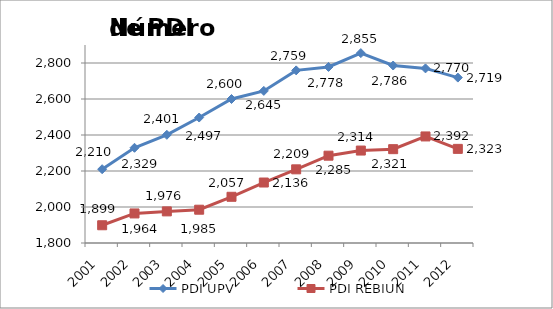
| Category | PDI UPV | PDI REBIUN |
|---|---|---|
| 2001 | 2210 | 1898.552 |
| 2002 | 2329 | 1964.22 |
| 2003 | 2401 | 1975.656 |
| 2004 | 2497 | 1984.979 |
| 2005 | 2600 | 2056.705 |
| 2006 | 2645 | 2136.007 |
| 2007 | 2759 | 2209.264 |
| 2008 | 2778 | 2285.075 |
| 2009 | 2855 | 2313.608 |
| 2010 | 2786 | 2321.307 |
| 2011 | 2770 | 2392 |
| 2012 | 2719 | 2323 |